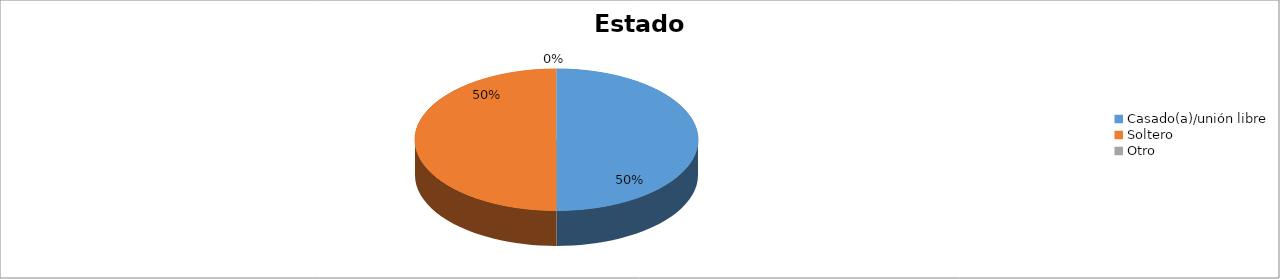
| Category | Series 0 |
|---|---|
| Casado(a)/unión libre | 0.5 |
| Soltero | 0.5 |
| Otro | 0 |